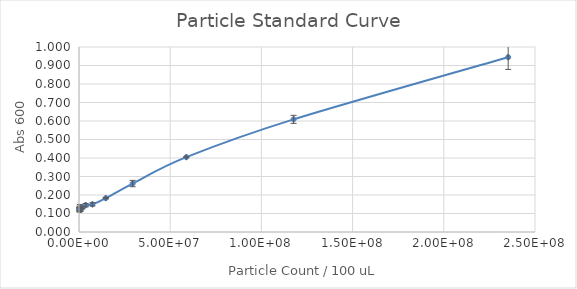
| Category | Series 0 |
|---|---|
| 235294117.64705887 | 0.945 |
| 117647058.82352944 | 0.609 |
| 58823529.41176472 | 0.405 |
| 29411764.70588236 | 0.262 |
| 14705882.35294118 | 0.183 |
| 7352941.17647059 | 0.149 |
| 3676470.588235295 | 0.145 |
| 1838235.2941176475 | 0.131 |
| 919117.6470588237 | 0.12 |
| 459558.82352941186 | 0.13 |
| 229779.41176470593 | 0.124 |
| 0.0 | 0.123 |